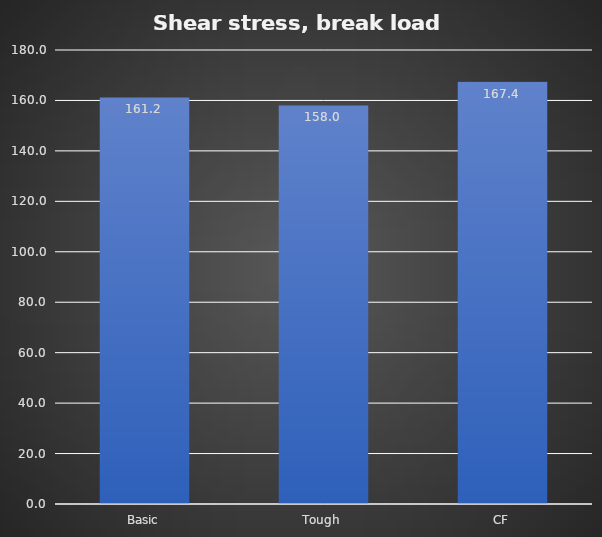
| Category | Break kg |
|---|---|
| Basic | 161.2 |
| Tough | 158 |
| CF | 167.4 |